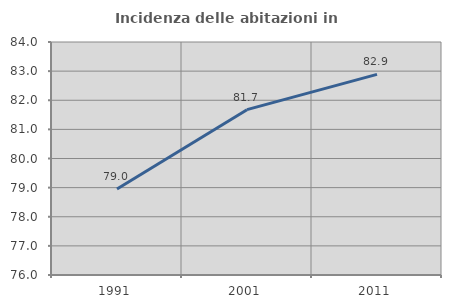
| Category | Incidenza delle abitazioni in proprietà  |
|---|---|
| 1991.0 | 78.951 |
| 2001.0 | 81.677 |
| 2011.0 | 82.889 |